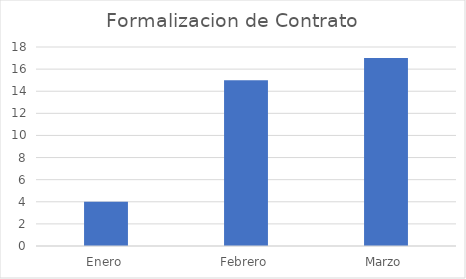
| Category | Formalizacion de Contrato |
|---|---|
| Enero | 4 |
| Febrero | 15 |
| Marzo | 17 |